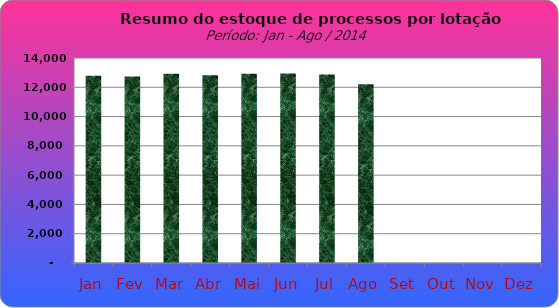
| Category | Series 0 |
|---|---|
| Jan | 12795 |
| Fev | 12744 |
| Mar | 12928 |
| Abr | 12816 |
| Mai | 12923 |
| Jun | 12943 |
| Jul | 12869 |
| Ago | 12202 |
| Set | 0 |
| Out | 0 |
| Nov | 0 |
| Dez | 0 |